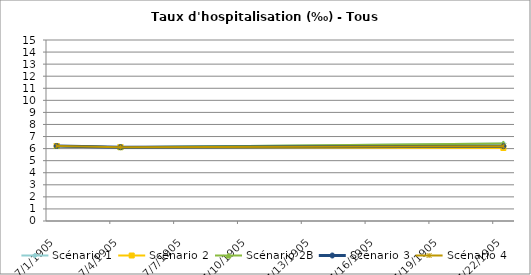
| Category | Scénario 1 | Scénario 2 | Scénario 2B | Scénario 3 | Scénario 4 |
|---|---|---|---|---|---|
| 2009.0 | 6.217 | 6.217 | 6.217 | 6.217 | 6.217 |
| 2012.0 | 6.12 | 6.12 | 6.12 | 6.12 | 6.12 |
| 2030.0 | 6.425 | 6.049 | 6.425 | 6.2 | 6.2 |